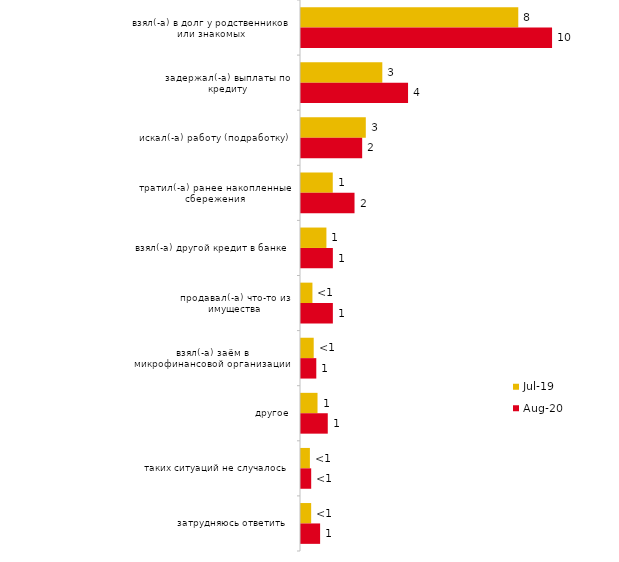
| Category | июл.19 | авг.20 |
|---|---|---|
| взял(-а) в долг у родственников или знакомых | 8.465 | 9.782 |
| задержал(-а) выплаты по кредиту | 3.168 | 4.171 |
| искал(-а) работу (подработку) | 2.525 | 2.383 |
| тратил(-а) ранее накопленные сбережения | 1.238 | 2.085 |
| взял(-а) другой кредит в банке | 0.99 | 1.241 |
| продавал(-а) что-то из имущества | 0.446 | 1.241 |
| взял(-а) заём в микрофинансовой организации | 0.495 | 0.596 |
| другое | 0.644 | 1.043 |
| таких ситуаций не случалось | 0.347 | 0.397 |
| затрудняюсь ответить | 0.396 | 0.745 |